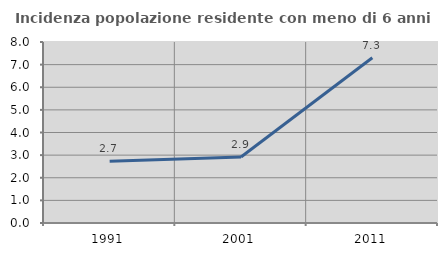
| Category | Incidenza popolazione residente con meno di 6 anni |
|---|---|
| 1991.0 | 2.725 |
| 2001.0 | 2.918 |
| 2011.0 | 7.303 |